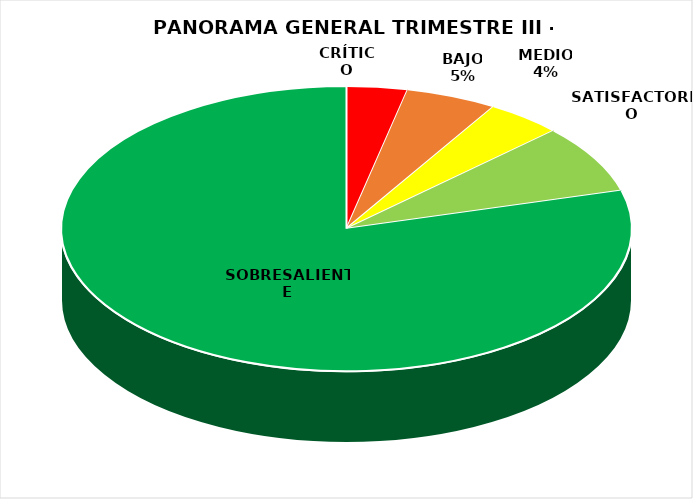
| Category | Series 0 |
|---|---|
| CRÍTICO | 4 |
| BAJO | 6 |
| MEDIO | 5 |
| SATISFACTORIO | 9 |
| SOBRESALIENTE | 92 |